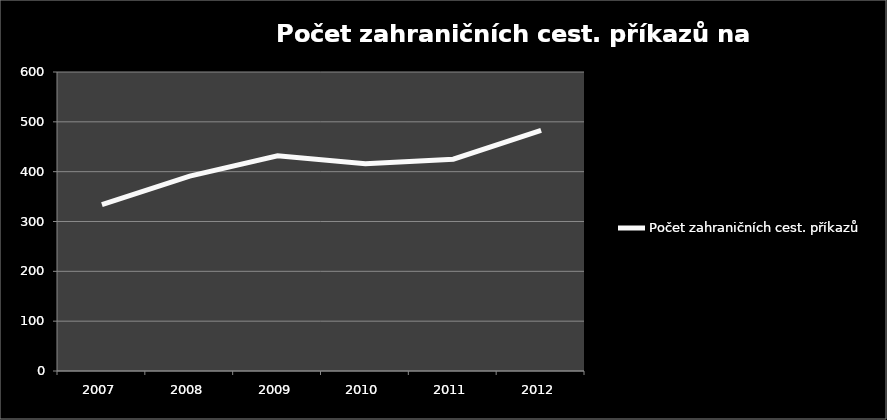
| Category | Počet zahraničních cest. příkazů  |
|---|---|
| 2007.0 | 334 |
| 2008.0 | 391 |
| 2009.0 | 432 |
| 2010.0 | 416 |
| 2011.0 | 425 |
| 2012.0 | 483 |